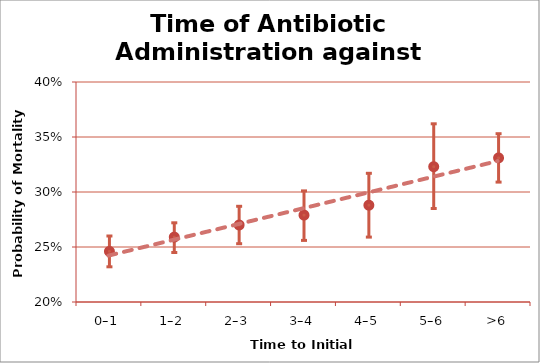
| Category | Time of Antibiotic Administration against Probability of Mortality |
|---|---|
| 0–1 | 0.246 |
| 1–2 | 0.259 |
| 2–3 | 0.27 |
| 3–4 | 0.279 |
| 4–5 | 0.288 |
| 5–6 | 0.323 |
| >6 | 0.331 |